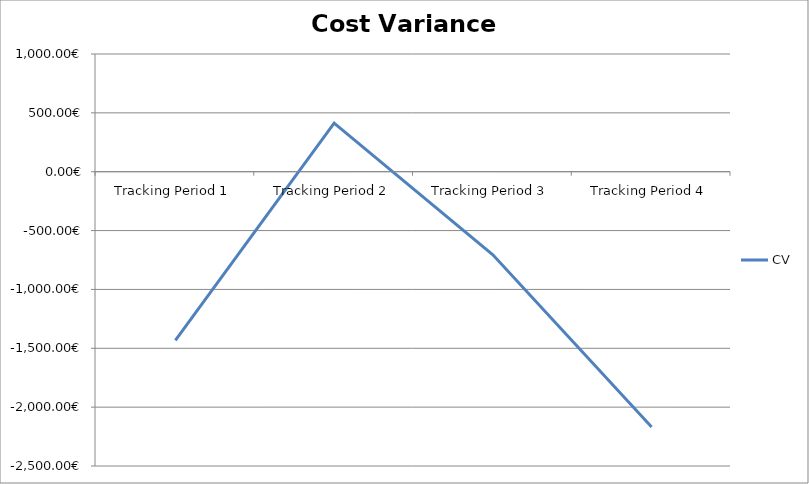
| Category | CV |
|---|---|
| Tracking Period 1 | -1433 |
| Tracking Period 2 | 412 |
| Tracking Period 3 | -706 |
| Tracking Period 4 | -2168 |